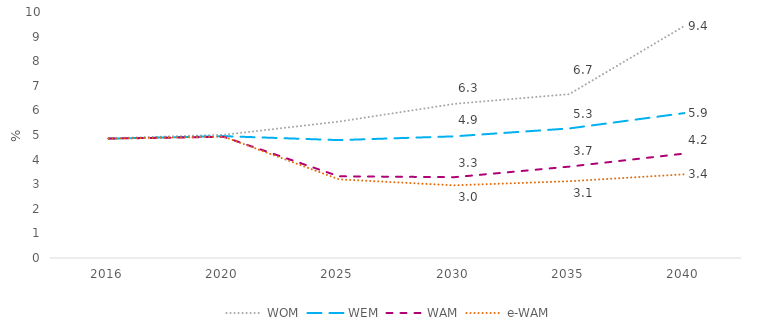
| Category | WOM | WEM | WAM | e-WAM |
|---|---|---|---|---|
| 2016.0 | 4.868 | 4.852 | 4.854 | 4.853 |
| 2020.0 | 5.009 | 4.953 | 4.925 | 4.932 |
| 2025.0 | 5.544 | 4.792 | 3.322 | 3.198 |
| 2030.0 | 6.265 | 4.945 | 3.285 | 2.954 |
| 2035.0 | 6.661 | 5.266 | 3.715 | 3.121 |
| 2040.0 | 9.433 | 5.891 | 4.245 | 3.402 |